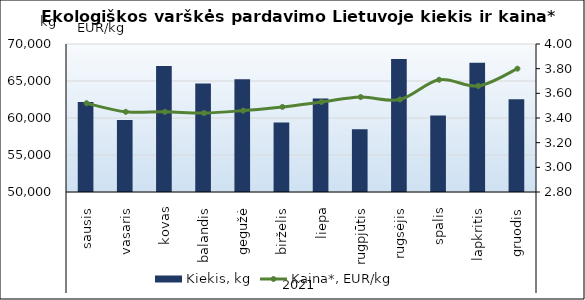
| Category | Kiekis, kg |
|---|---|
| 0 | 62175 |
| 1 | 59714 |
| 2 | 67029 |
| 3 | 64667 |
| 4 | 65245 |
| 5 | 59393 |
| 6 | 62650 |
| 7 | 58485 |
| 8 | 67958 |
| 9 | 60354 |
| 10 | 67451 |
| 11 | 62535 |